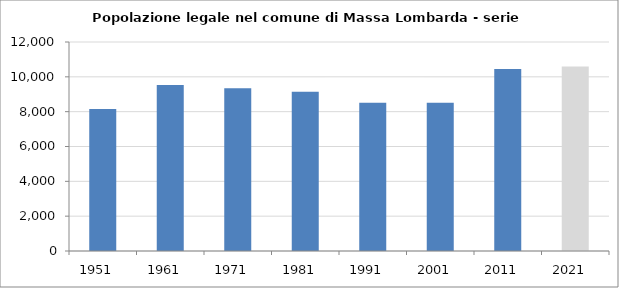
| Category | Popolazione residente |
|---|---|
| 1951   | 8158 |
| 1961   | 9532 |
| 1971   | 9349 |
| 1981   | 9141 |
| 1991   | 8513 |
| 2001   | 8518 |
| 2011   | 10449 |
| 2021   | 10590 |